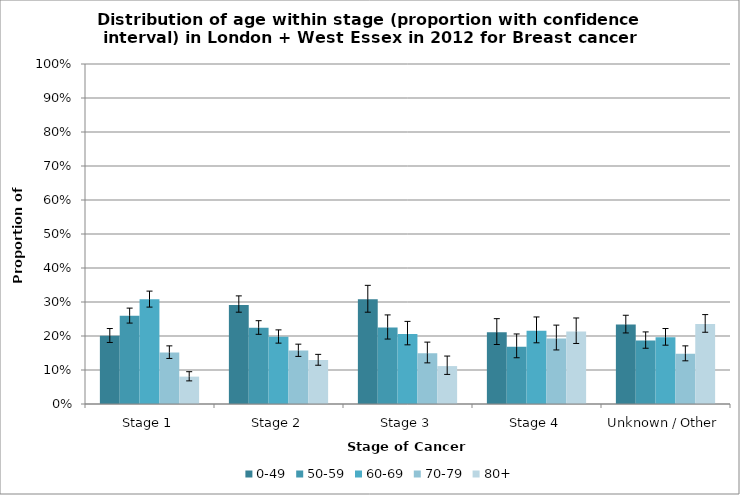
| Category | 0-49 | 50-59 | 60-69 | 70-79 | 80+ |
|---|---|---|---|---|---|
| Stage 1 | 0.201 | 0.26 | 0.308 | 0.152 | 0.08 |
| Stage 2 | 0.291 | 0.224 | 0.198 | 0.157 | 0.129 |
| Stage 3 | 0.308 | 0.225 | 0.206 | 0.149 | 0.112 |
| Stage 4 | 0.211 | 0.168 | 0.215 | 0.193 | 0.213 |
| Unknown / Other | 0.234 | 0.187 | 0.196 | 0.148 | 0.236 |